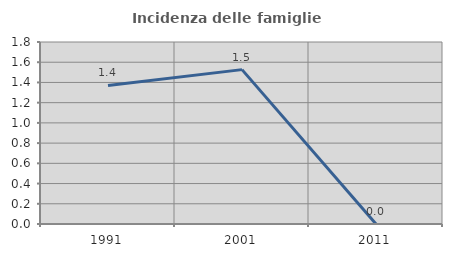
| Category | Incidenza delle famiglie numerose |
|---|---|
| 1991.0 | 1.37 |
| 2001.0 | 1.527 |
| 2011.0 | 0 |